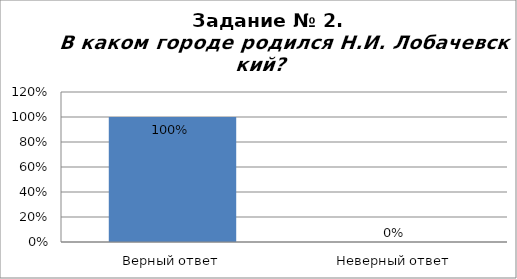
| Category | Верный ответ |
|---|---|
| Верный ответ | 1 |
| Неверный ответ | 0 |